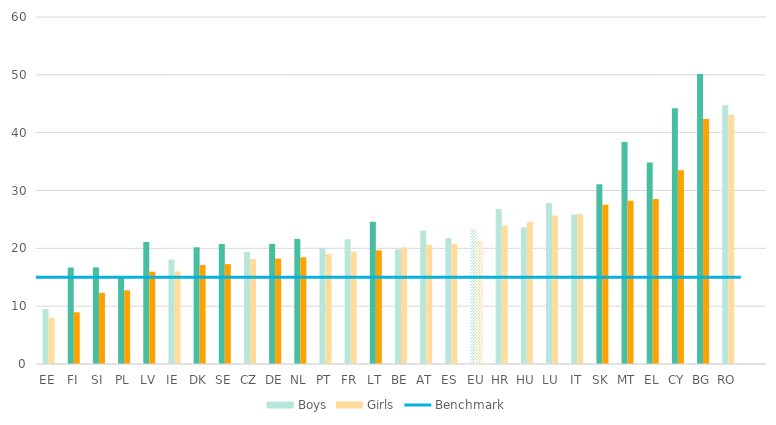
| Category | Boys | Girls |
|---|---|---|
| 0 | 9.501 | 8.014 |
| 1 | 16.683 | 8.944 |
| 2 | 16.708 | 12.297 |
| 3 | 14.951 | 12.734 |
| 4 | 21.092 | 15.968 |
| 5 | 18.06 | 16.004 |
| 6 | 20.182 | 17.127 |
| 7 | 20.747 | 17.266 |
| 8 | 19.368 | 18.135 |
| 9 | 20.781 | 18.228 |
| 10 | 21.621 | 18.447 |
| 11 | 20.075 | 19.032 |
| 12 | 21.552 | 19.419 |
| 13 | 24.608 | 19.653 |
| 14 | 19.834 | 20.179 |
| 15 | 23.084 | 20.581 |
| 16 | 21.769 | 20.767 |
| 17 | 23.25 | 21.223 |
| 18 | 26.794 | 23.961 |
| 19 | 23.622 | 24.577 |
| 20 | 27.835 | 25.666 |
| 21 | 25.844 | 25.917 |
| 22 | 31.083 | 27.544 |
| 23 | 38.398 | 28.208 |
| 24 | 34.857 | 28.525 |
| 25 | 44.217 | 33.481 |
| 26 | 50.163 | 42.369 |
| 27 | 44.76 | 43.082 |